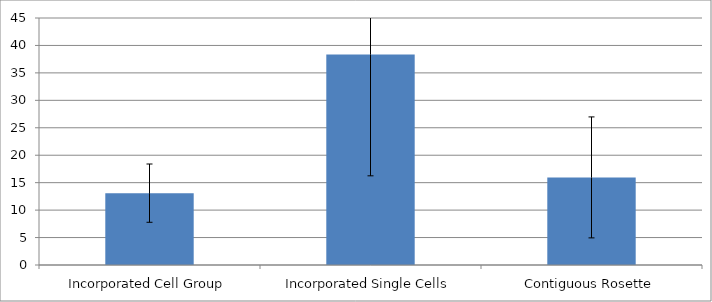
| Category | Series 0 |
|---|---|
| Incorporated Cell Group | 13.09 |
| Incorporated Single Cells | 38.333 |
| Contiguous Rosette | 15.96 |